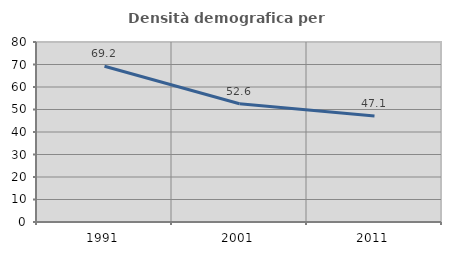
| Category | Densità demografica |
|---|---|
| 1991.0 | 69.211 |
| 2001.0 | 52.578 |
| 2011.0 | 47.103 |